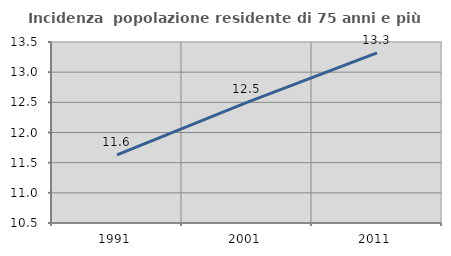
| Category | Incidenza  popolazione residente di 75 anni e più |
|---|---|
| 1991.0 | 11.628 |
| 2001.0 | 12.498 |
| 2011.0 | 13.318 |